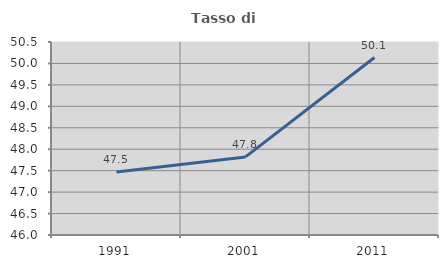
| Category | Tasso di occupazione   |
|---|---|
| 1991.0 | 47.468 |
| 2001.0 | 47.82 |
| 2011.0 | 50.137 |